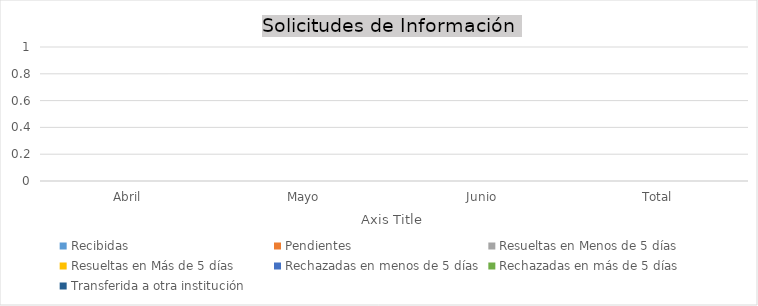
| Category | Recibidas  | Pendientes  | Resueltas en Menos de 5 días | Resueltas en Más de 5 días | Rechazadas en menos de 5 días | Rechazadas en más de 5 días | Transferida a otra institución |
|---|---|---|---|---|---|---|---|
| Abril | 0 | 0 | 0 | 0 | 0 | 0 | 0 |
| Mayo | 0 | 0 | 0 | 0 | 0 | 0 | 0 |
| Junio | 0 | 0 | 0 | 0 | 0 | 0 | 0 |
| Total | 0 | 0 | 0 | 0 | 0 | 0 | 0 |